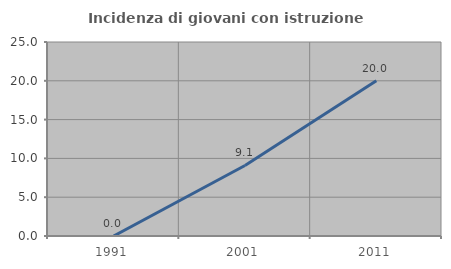
| Category | Incidenza di giovani con istruzione universitaria |
|---|---|
| 1991.0 | 0 |
| 2001.0 | 9.091 |
| 2011.0 | 20 |